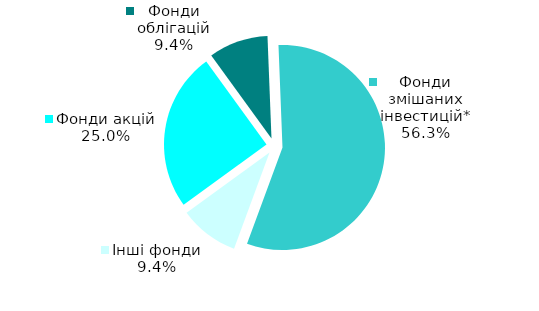
| Category | Series 0 |
|---|---|
| Фонди акцій | 8 |
| Фонди облігацій | 3 |
| Фонди змішаних інвестицій* | 18 |
| Інші фонди | 3 |